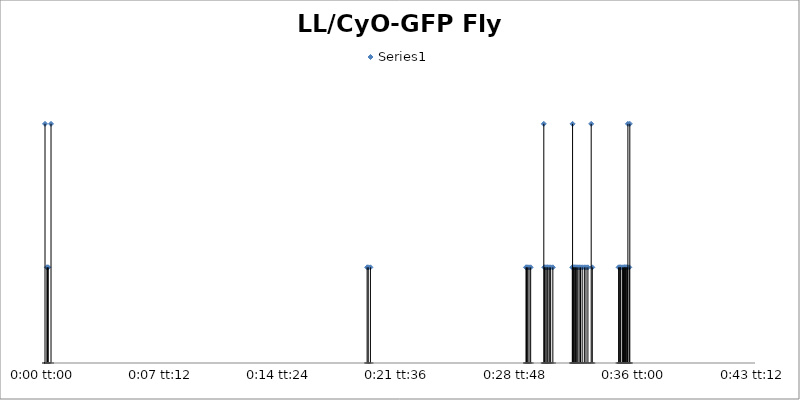
| Category | Series 0 |
|---|---|
| 0.0 | 5 |
| 8.101851851852193e-05 | 2 |
| 0.00010416666666668295 | 2 |
| 0.00013888888888888284 | 2 |
| 0.0002546296296296324 | 5 |
| 0.013611111111111115 | 2 |
| 0.01365740740740741 | 2 |
| 0.013749999999999998 | 2 |
| 0.020324074074074064 | 2 |
| 0.020347222222222225 | 2 |
| 0.02039351851851852 | 2 |
| 0.020451388888888908 | 2 |
| 0.020520833333333335 | 2 |
| 0.021076388888888895 | 5 |
| 0.021099537037037028 | 2 |
| 0.02112268518518519 | 2 |
| 0.021168981481481483 | 2 |
| 0.021215277777777777 | 2 |
| 0.021250000000000005 | 2 |
| 0.021307870370370366 | 2 |
| 0.021365740740740755 | 2 |
| 0.021458333333333343 | 2 |
| 0.0222800925925926 | 2 |
| 0.022291666666666668 | 5 |
| 0.022326388888888896 | 2 |
| 0.022349537037037057 | 2 |
| 0.022384259259259257 | 2 |
| 0.022418981481481484 | 2 |
| 0.02246527777777778 | 2 |
| 0.022511574074074073 | 2 |
| 0.02256944444444446 | 2 |
| 0.022627314814814822 | 2 |
| 0.02269675925925925 | 2 |
| 0.022789351851851866 | 2 |
| 0.022858796296296294 | 2 |
| 0.022939814814814816 | 2 |
| 0.0230787037037037 | 5 |
| 0.023124999999999993 | 2 |
| 0.02423611111111111 | 2 |
| 0.024282407407407405 | 2 |
| 0.024305555555555566 | 2 |
| 0.0243287037037037 | 2 |
| 0.024398148148148155 | 2 |
| 0.02444444444444445 | 2 |
| 0.024490740740740743 | 2 |
| 0.02450231481481481 | 2 |
| 0.02452546296296297 | 2 |
| 0.0245601851851852 | 2 |
| 0.0245949074074074 | 2 |
| 0.024606481481481465 | 2 |
| 0.024629629629629626 | 5 |
| 0.024687500000000015 | 2 |
| 0.024710648148148148 | 5 |